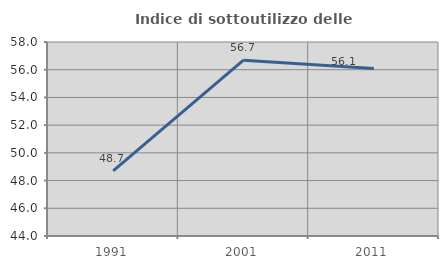
| Category | Indice di sottoutilizzo delle abitazioni  |
|---|---|
| 1991.0 | 48.692 |
| 2001.0 | 56.687 |
| 2011.0 | 56.082 |